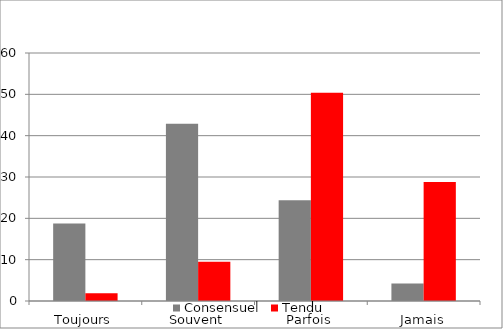
| Category | Consensuel | Tendu |
|---|---|---|
| Toujours | 18.73 | 1.87 |
| Souvent | 42.86 | 9.52 |
| Parfois | 24.37 | 50.39 |
| Jamais | 4.26 | 28.82 |